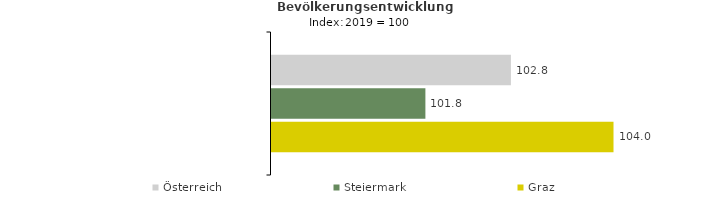
| Category | Österreich | Steiermark | Graz |
|---|---|---|---|
| 2023.0 | 102.8 | 101.8 | 104 |